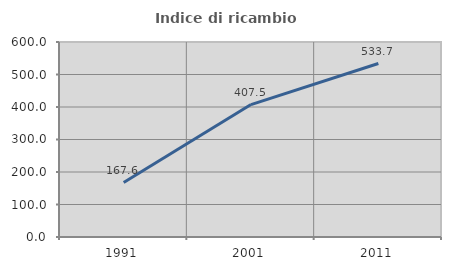
| Category | Indice di ricambio occupazionale  |
|---|---|
| 1991.0 | 167.589 |
| 2001.0 | 407.5 |
| 2011.0 | 533.735 |